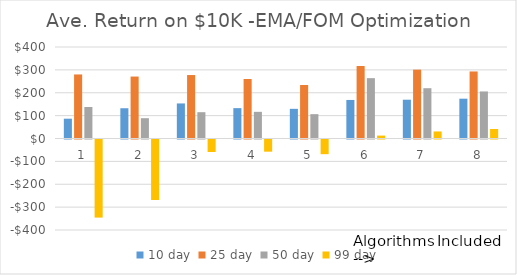
| Category | 10 day | 25 day | 50 day | 99 day |
|---|---|---|---|---|
| 1.0 | 86.613 | 279.996 | 137.653 | -341.43 |
| 2.0 | 132.318 | 270.82 | 88.81 | -264.41 |
| 3.0 | 153.255 | 277.413 | 115.024 | -54.56 |
| 4.0 | 132.784 | 260.094 | 116.538 | -53.221 |
| 5.0 | 129.695 | 233.793 | 106.435 | -64.192 |
| 6.0 | 168.479 | 316.859 | 263.797 | 12.703 |
| 7.0 | 169.578 | 300.999 | 219.903 | 30.791 |
| 8.0 | 174.046 | 293.056 | 205.73 | 41.514 |